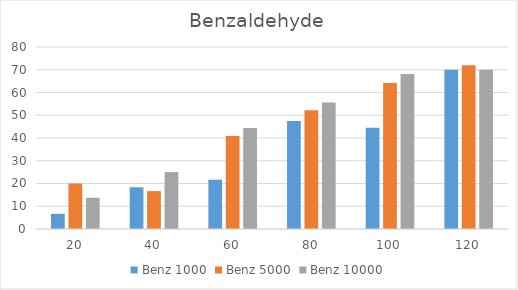
| Category | Benz 1000 | Benz 5000 | Benz 10000 |
|---|---|---|---|
| 20.0 | 6.667 | 20 | 13.75 |
| 40.0 | 18.333 | 16.667 | 25 |
| 60.0 | 21.667 | 40.833 | 44.375 |
| 80.0 | 47.5 | 52.167 | 55.625 |
| 100.0 | 44.5 | 64.167 | 68.125 |
| 120.0 | 70 | 72 | 70 |